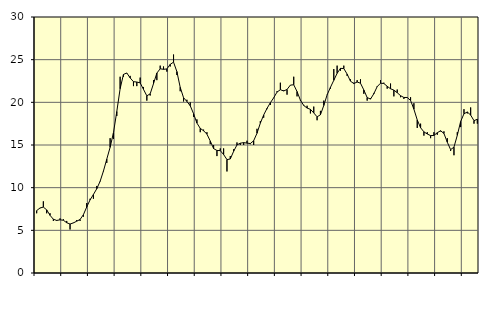
| Category | Piggar | Series 1 |
|---|---|---|
| nan | 7 | 7.31 |
| 87.0 | 7.6 | 7.62 |
| 87.0 | 8.4 | 7.72 |
| 87.0 | 7 | 7.4 |
| nan | 7 | 6.76 |
| 88.0 | 6.1 | 6.3 |
| 88.0 | 6.1 | 6.16 |
| 88.0 | 6.4 | 6.23 |
| nan | 6.3 | 6.18 |
| 89.0 | 6.1 | 5.89 |
| 89.0 | 5.1 | 5.74 |
| 89.0 | 5.9 | 5.87 |
| nan | 6.2 | 6.07 |
| 90.0 | 6.1 | 6.27 |
| 90.0 | 6.6 | 6.83 |
| 90.0 | 8.2 | 7.74 |
| nan | 8.7 | 8.57 |
| 91.0 | 8.7 | 9.2 |
| 91.0 | 10.2 | 9.87 |
| 91.0 | 10.7 | 10.74 |
| nan | 11.9 | 11.94 |
| 92.0 | 12.9 | 13.34 |
| 92.0 | 15.8 | 14.73 |
| 92.0 | 15.7 | 16.43 |
| nan | 18.4 | 18.92 |
| 93.0 | 23 | 21.6 |
| 93.0 | 23 | 23.27 |
| 93.0 | 23.4 | 23.44 |
| nan | 23.1 | 22.86 |
| 94.0 | 21.9 | 22.42 |
| 94.0 | 21.9 | 22.38 |
| 94.0 | 22.9 | 22.28 |
| nan | 21.8 | 21.52 |
| 95.0 | 20.2 | 20.76 |
| 95.0 | 20.8 | 21 |
| 95.0 | 22.6 | 22.19 |
| nan | 22.6 | 23.43 |
| 96.0 | 24.3 | 23.93 |
| 96.0 | 24.2 | 23.87 |
| 96.0 | 23.6 | 23.91 |
| nan | 24.2 | 24.45 |
| 97.0 | 25.6 | 24.71 |
| 97.0 | 23.2 | 23.6 |
| 97.0 | 21.3 | 21.76 |
| nan | 20.1 | 20.54 |
| 98.0 | 20.3 | 20.1 |
| 98.0 | 20 | 19.6 |
| 98.0 | 18.3 | 18.67 |
| nan | 18 | 17.57 |
| 99.0 | 16.5 | 16.95 |
| 99.0 | 16.8 | 16.67 |
| 99.0 | 16.5 | 16.27 |
| nan | 15.1 | 15.47 |
| 0.0 | 15 | 14.58 |
| 0.0 | 13.7 | 14.36 |
| 0.0 | 14.6 | 14.34 |
| nan | 14.6 | 13.88 |
| 1.0 | 11.9 | 13.29 |
| 1.0 | 13.7 | 13.36 |
| 1.0 | 14.5 | 14.26 |
| nan | 15.3 | 15.01 |
| 2.0 | 15 | 15.21 |
| 2.0 | 15 | 15.28 |
| 2.0 | 15.5 | 15.22 |
| nan | 15.1 | 15.17 |
| 3.0 | 15 | 15.5 |
| 3.0 | 16.9 | 16.38 |
| 3.0 | 17.8 | 17.56 |
| nan | 18.2 | 18.52 |
| 4.0 | 19.2 | 19.29 |
| 4.0 | 19.7 | 19.95 |
| 4.0 | 20.5 | 20.53 |
| nan | 21.3 | 21.2 |
| 5.0 | 22.3 | 21.48 |
| 5.0 | 21.4 | 21.33 |
| 5.0 | 20.9 | 21.51 |
| nan | 22 | 22.02 |
| 6.0 | 23 | 22.06 |
| 6.0 | 20.7 | 21.26 |
| 6.0 | 20.2 | 20.26 |
| nan | 19.7 | 19.63 |
| 7.0 | 19.6 | 19.33 |
| 7.0 | 18.7 | 19.18 |
| 7.0 | 19.5 | 18.76 |
| nan | 17.9 | 18.3 |
| 8.0 | 19 | 18.54 |
| 8.0 | 20.2 | 19.63 |
| 8.0 | 20.9 | 20.87 |
| nan | 21.6 | 21.76 |
| 9.0 | 23.9 | 22.58 |
| 9.0 | 24.3 | 23.4 |
| 9.0 | 23.7 | 23.98 |
| nan | 24.3 | 23.96 |
| 10.0 | 23.1 | 23.31 |
| 10.0 | 22.7 | 22.48 |
| 10.0 | 22.3 | 22.2 |
| nan | 22.6 | 22.38 |
| 11.0 | 22.7 | 22.24 |
| 11.0 | 21 | 21.45 |
| 11.0 | 20.2 | 20.56 |
| nan | 20.5 | 20.38 |
| 12.0 | 21.1 | 21.01 |
| 12.0 | 21.9 | 21.84 |
| 12.0 | 22.6 | 22.24 |
| nan | 22.3 | 22.21 |
| 13.0 | 21.6 | 21.88 |
| 13.0 | 22.2 | 21.59 |
| 13.0 | 20.7 | 21.43 |
| nan | 21.5 | 21.13 |
| 14.0 | 20.6 | 20.78 |
| 14.0 | 20.4 | 20.57 |
| 14.0 | 20.6 | 20.57 |
| nan | 20.6 | 20.22 |
| 15.0 | 19.9 | 19.2 |
| 15.0 | 17 | 17.94 |
| 15.0 | 17.5 | 17.02 |
| nan | 16.1 | 16.54 |
| 16.0 | 16.5 | 16.29 |
| 16.0 | 15.8 | 16.1 |
| 16.0 | 16.5 | 16.12 |
| nan | 16.2 | 16.44 |
| 17.0 | 16.6 | 16.67 |
| 17.0 | 16.6 | 16.35 |
| 17.0 | 15.8 | 15.33 |
| nan | 14.3 | 14.46 |
| 18.0 | 13.8 | 14.75 |
| 18.0 | 16.5 | 16.14 |
| 18.0 | 17.1 | 17.75 |
| nan | 19.2 | 18.66 |
| 19.0 | 18.7 | 18.87 |
| 19.0 | 19.4 | 18.51 |
| 19.0 | 17.5 | 17.85 |
| nan | 17.5 | 18.02 |